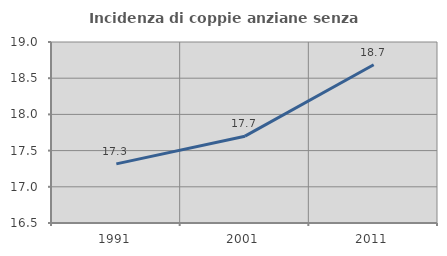
| Category | Incidenza di coppie anziane senza figli  |
|---|---|
| 1991.0 | 17.317 |
| 2001.0 | 17.699 |
| 2011.0 | 18.686 |